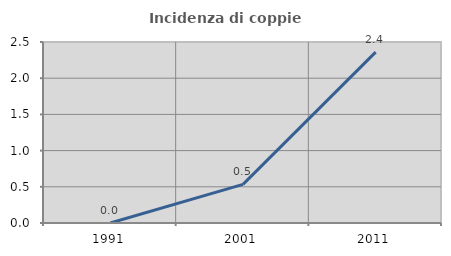
| Category | Incidenza di coppie miste |
|---|---|
| 1991.0 | 0 |
| 2001.0 | 0.534 |
| 2011.0 | 2.361 |